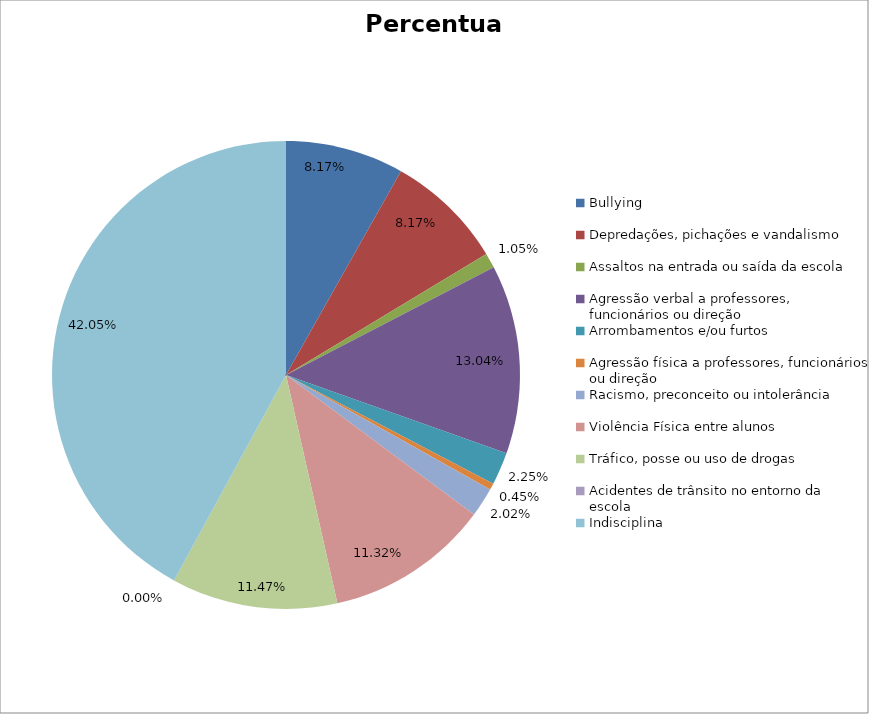
| Category | Percentual |
|---|---|
| Bullying | 0.082 |
| Depredações, pichações e vandalismo | 0.082 |
| Assaltos na entrada ou saída da escola | 0.01 |
| Agressão verbal a professores, funcionários ou direção | 0.13 |
| Arrombamentos e/ou furtos | 0.022 |
| Agressão física a professores, funcionários ou direção | 0.004 |
| Racismo, preconceito ou intolerância | 0.02 |
| Violência Física entre alunos | 0.113 |
| Tráfico, posse ou uso de drogas | 0.115 |
| Acidentes de trânsito no entorno da escola | 0 |
| Indisciplina | 0.421 |